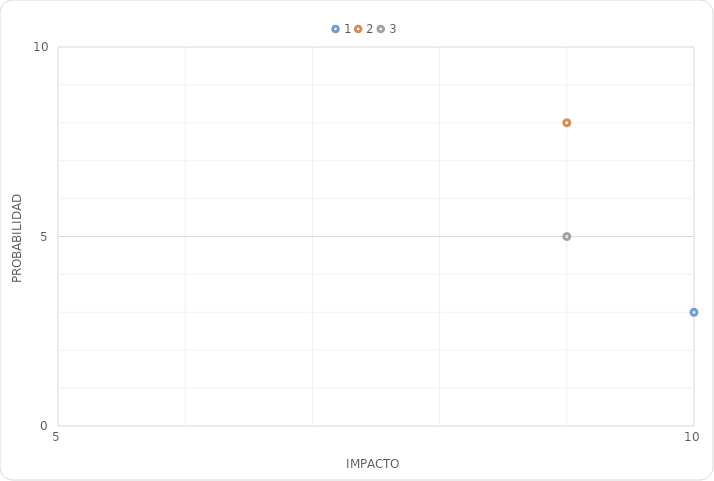
| Category | Series 0 |
|---|---|
| 10.0 | 3 |
| 9.0 | 8 |
| 9.0 | 5 |